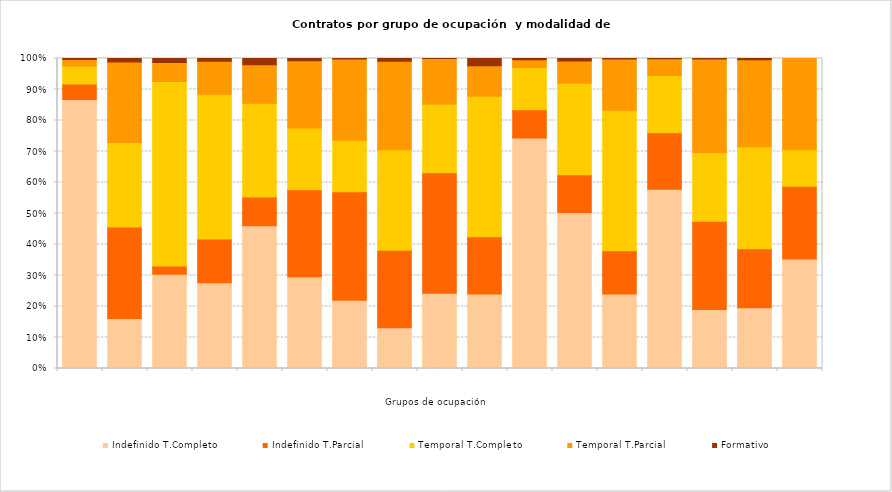
| Category | Indefinido T.Completo | Indefinido T.Parcial | Temporal T.Completo | Temporal T.Parcial | Formativo |
|---|---|---|---|---|---|
|  | 9475 | 549 | 633 | 229 | 32 |
|  | 8963 | 16419 | 15173 | 14431 | 632 |
|  | 64377 | 5596 | 125748 | 13083 | 2665 |
|  | 49284 | 25157 | 83227 | 18972 | 1632 |
|  | 28531 | 5696 | 18736 | 7693 | 1253 |
|  | 24385 | 23111 | 16378 | 17872 | 579 |
|  | 57766 | 92097 | 43592 | 68963 | 318 |
|  | 12205 | 23162 | 30050 | 26420 | 828 |
|  | 5104 | 8168 | 4650 | 3096 | 6 |
|  | 491 | 377 | 925 | 201 | 47 |
|  | 29985 | 3648 | 5490 | 1032 | 153 |
|  | 12200 | 2958 | 7137 | 1756 | 188 |
|  | 2790 | 1615 | 5253 | 1912 | 23 |
|  | 28806 | 9049 | 9226 | 2654 | 60 |
|  | 35759 | 53343 | 41595 | 56564 | 367 |
|  | 12746 | 12354 | 21420 | 18258 | 260 |
|  | 6 | 4 | 2 | 5 | 0 |